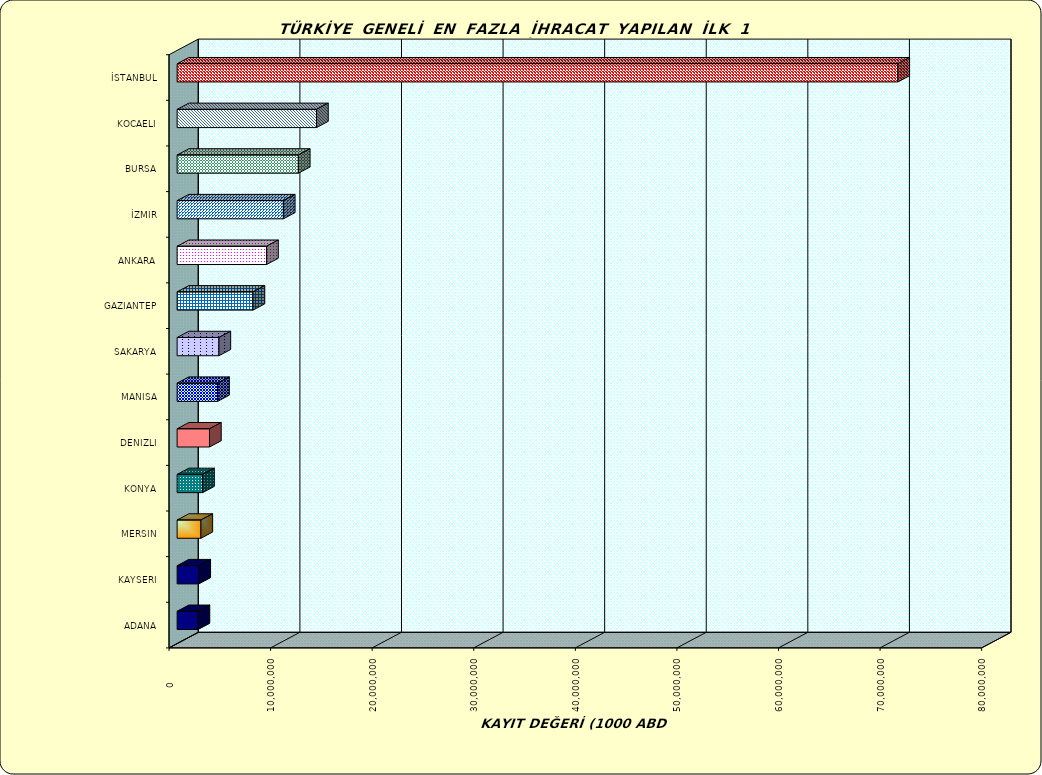
| Category | Series 0 |
|---|---|
| İSTANBUL | 70950257.7 |
| KOCAELI | 13722272.798 |
| BURSA | 11932282.034 |
| İZMIR | 10456023.438 |
| ANKARA | 8807728.156 |
| GAZIANTEP | 7470367.401 |
| SAKARYA | 4115528.197 |
| MANISA | 3984801.909 |
| DENIZLI | 3185833.761 |
| KONYA | 2508272.066 |
| MERSIN | 2341280.698 |
| KAYSERI | 2136977.896 |
| ADANA | 2058691.931 |